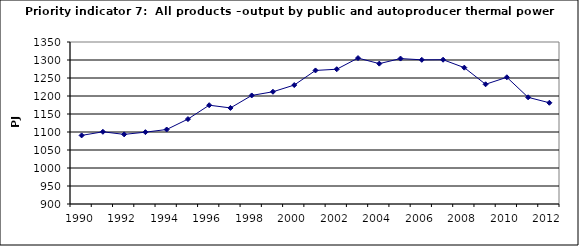
| Category | All products –output by public and autoproducer thermal power stations, PJ |
|---|---|
| 1990 | 1090.57 |
| 1991 | 1100.534 |
| 1992 | 1093.374 |
| 1993 | 1099.559 |
| 1994 | 1106.914 |
| 1995 | 1135.836 |
| 1996 | 1174.446 |
| 1997 | 1166.879 |
| 1998 | 1201.55 |
| 1999 | 1211.789 |
| 2000 | 1230.419 |
| 2001 | 1271.005 |
| 2002 | 1274.377 |
| 2003 | 1305.361 |
| 2004 | 1289.928 |
| 2005 | 1303.964 |
| 2006 | 1300.435 |
| 2007 | 1300.742 |
| 2008 | 1278.751 |
| 2009 | 1232.548 |
| 2010 | 1252.027 |
| 2011 | 1196.323 |
| 2012 | 1181.181 |